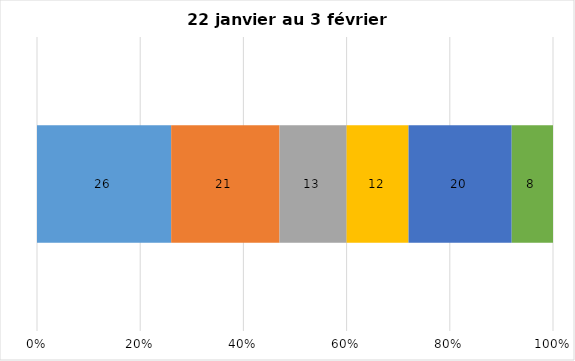
| Category | Plusieurs fois par jour | Une fois par jour | Quelques fois par semaine   | Une fois par semaine ou moins   |  Jamais   |  Je n’utilise pas les médias sociaux |
|---|---|---|---|---|---|---|
| 0 | 26 | 21 | 13 | 12 | 20 | 8 |